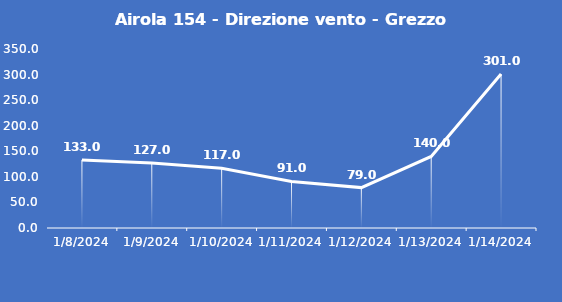
| Category | Airola 154 - Direzione vento - Grezzo (°N) |
|---|---|
| 1/8/24 | 133 |
| 1/9/24 | 127 |
| 1/10/24 | 117 |
| 1/11/24 | 91 |
| 1/12/24 | 79 |
| 1/13/24 | 140 |
| 1/14/24 | 301 |